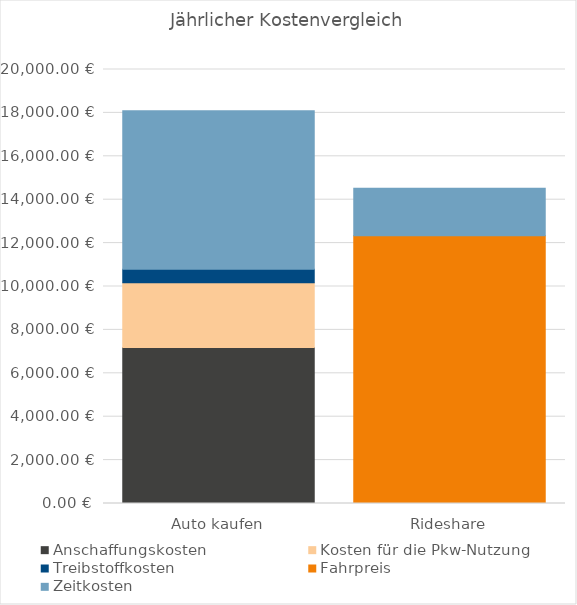
| Category | Anschaffungskosten | Kosten für die Pkw-Nutzung | Treibstoffkosten | Fahrpreis | Zeitkosten |
|---|---|---|---|---|---|
| Auto kaufen | 7187.315 | 2990 | 617.692 | 0 | 7300 |
| Rideshare | 0 | 0 | 0 | 12340.65 | 2190 |